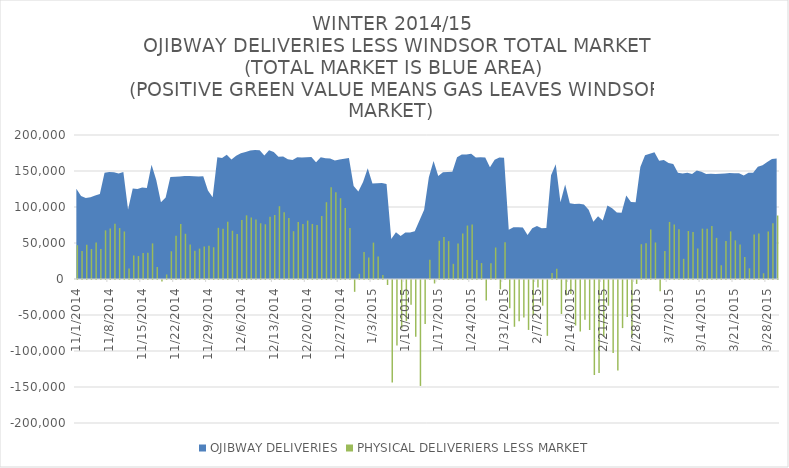
| Category | PHYSICAL DELIVERIERS LESS MARKET |
|---|---|
| 2013-11-01 | 46965.617 |
| 2013-11-02 | 38795.013 |
| 2013-11-03 | 47736.546 |
| 2013-11-04 | 41593.079 |
| 2013-11-05 | 50577.003 |
| 2013-11-06 | 41809.983 |
| 2013-11-07 | 67591.325 |
| 2013-11-08 | 69997.944 |
| 2013-11-09 | 76813.474 |
| 2013-11-10 | 70756.553 |
| 2013-11-11 | 66016.469 |
| 2013-11-12 | 14622.028 |
| 2013-11-13 | 32497.27 |
| 2013-11-14 | 31890.417 |
| 2013-11-15 | 36143.072 |
| 2013-11-16 | 36456.208 |
| 2013-11-17 | 49446.672 |
| 2013-11-18 | 16628.926 |
| 2013-11-19 | -2241.763 |
| 2013-11-20 | 6290.85 |
| 2013-11-21 | 38517.229 |
| 2013-11-22 | 59968.959 |
| 2013-11-23 | 76423.098 |
| 2013-11-24 | 62804.031 |
| 2013-11-25 | 48041.363 |
| 2013-11-26 | 39338.718 |
| 2013-11-27 | 42194.16 |
| 2013-11-28 | 45093.602 |
| 2013-11-29 | 46323.989 |
| 2013-11-30 | 44080.099 |
| 2013-12-01 | 71065.33 |
| 2013-12-02 | 69918.894 |
| 2013-12-03 | 79636.629 |
| 2013-12-04 | 67039.134 |
| 2013-12-05 | 62532.924 |
| 2013-12-06 | 81916.64 |
| 2013-12-07 | 88410.275 |
| 2013-12-08 | 85313.773 |
| 2013-12-09 | 82667.637 |
| 2013-12-10 | 77410.85 |
| 2013-12-11 | 75992.77 |
| 2013-12-12 | 86423.471 |
| 2013-12-13 | 88736.864 |
| 2013-12-14 | 101109.652 |
| 2013-12-15 | 92584.449 |
| 2013-12-16 | 84707.382 |
| 2013-12-17 | 66374.211 |
| 2013-12-18 | 79135.337 |
| 2013-12-19 | 76307.379 |
| 2013-12-20 | 81142.166 |
| 2013-12-21 | 76460.879 |
| 2013-12-22 | 74979.023 |
| 2013-12-23 | 87439.87 |
| 2013-12-24 | 106651.254 |
| 2013-12-25 | 127359.138 |
| 2013-12-26 | 120634.218 |
| 2013-12-27 | 112183.49 |
| 2013-12-28 | 98700.691 |
| 2013-12-29 | 70858.459 |
| 2013-12-30 | -16424.275 |
| 2013-12-31 | 7180.84 |
| 2014-01-01 | 37538.454 |
| 2014-01-02 | 29995.93 |
| 2014-01-03 | 50501.902 |
| 2014-01-04 | 31272.681 |
| 2014-01-05 | 5590.614 |
| 2014-01-06 | -6922.46 |
| 2014-01-07 | -142484.416 |
| 2014-01-08 | -91041.588 |
| 2014-01-09 | -67049.091 |
| 2014-01-10 | -57122.213 |
| 2014-01-11 | -34348.039 |
| 2014-01-12 | -78744.869 |
| 2014-01-13 | -147143.748 |
| 2014-01-14 | -61077.57 |
| 2014-01-15 | 26718.744 |
| 2014-01-16 | -4833.864 |
| 2014-01-17 | 53285.402 |
| 2014-01-18 | 58183.236 |
| 2014-01-19 | 52585.248 |
| 2014-01-20 | 21056.227 |
| 2014-01-21 | 49214.423 |
| 2014-01-22 | 63316.385 |
| 2014-01-23 | 74267.463 |
| 2014-01-24 | 75831.818 |
| 2014-01-25 | 26260.752 |
| 2014-01-26 | 22135.039 |
| 2014-01-27 | -28639.96 |
| 2014-01-28 | 21968.964 |
| 2014-01-29 | 43761.671 |
| 2014-01-30 | -12996.704 |
| 2014-01-31 | 51135.197 |
| 2014-02-01 | -39178.087 |
| 2014-02-02 | -64961.142 |
| 2014-02-03 | -57276.231 |
| 2014-02-04 | -52240.784 |
| 2014-02-05 | -69349.013 |
| 2014-02-06 | -49141.771 |
| 2014-02-07 | -10450.568 |
| 2014-02-08 | -35699.299 |
| 2014-02-09 | -77500.379 |
| 2014-02-10 | 8176.743 |
| 2014-02-11 | 14338.742 |
| 2014-02-12 | -47178.205 |
| 2014-02-13 | -21572.523 |
| 2014-02-14 | -19513.095 |
| 2014-02-15 | -63210.618 |
| 2014-02-16 | -71526.867 |
| 2014-02-17 | -55219.698 |
| 2014-02-18 | -69462.172 |
| 2014-02-19 | -131911.212 |
| 2014-02-20 | -129138.925 |
| 2014-02-21 | -78903.693 |
| 2014-02-22 | -35738.266 |
| 2014-02-23 | -101487.515 |
| 2014-02-24 | -125667.928 |
| 2014-02-25 | -66816.816 |
| 2014-02-26 | -51514.908 |
| 2014-02-27 | -79508.426 |
| 2014-02-28 | -5487.594 |
| 2014-03-01 | 48298.441 |
| 2014-03-02 | 49734.381 |
| 2014-03-03 | 68641.391 |
| 2014-03-04 | 50724.757 |
| 2014-03-05 | -15774.906 |
| 2014-03-06 | 39033.106 |
| 2014-03-07 | 79243.82 |
| 2014-03-08 | 75649.728 |
| 2014-03-09 | 69198.013 |
| 2014-03-10 | 28044.357 |
| 2014-03-11 | 66571.354 |
| 2014-03-12 | 65352.254 |
| 2014-03-13 | 42451.084 |
| 2014-03-14 | 69941.351 |
| 2014-03-15 | 69747.494 |
| 2014-03-16 | 73613.494 |
| 2014-03-17 | 57134.672 |
| 2014-03-18 | 19103.798 |
| 2014-03-19 | 52905.009 |
| 2014-03-20 | 66075.672 |
| 2014-03-21 | 53670.538 |
| 2014-03-22 | 47769.072 |
| 2014-03-23 | 30515.383 |
| 2014-03-24 | 14826.732 |
| 2014-03-25 | 61635.068 |
| 2014-03-26 | 63101.122 |
| 2014-03-27 | 7952.352 |
| 2014-03-28 | 66020.893 |
| 2014-03-29 | 77301.278 |
| 2014-03-30 | 88177.59 |